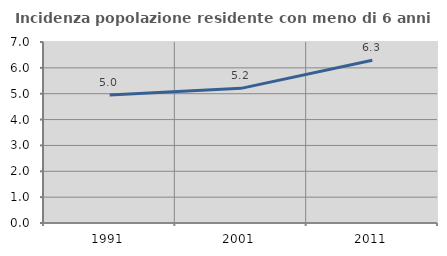
| Category | Incidenza popolazione residente con meno di 6 anni |
|---|---|
| 1991.0 | 4.955 |
| 2001.0 | 5.207 |
| 2011.0 | 6.298 |